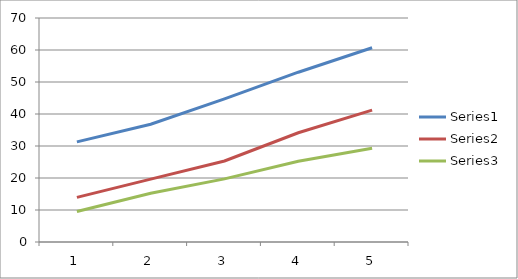
| Category | Series 0 | Series 1 | Series 2 |
|---|---|---|---|
| 0 | 31.296 | 13.95 | 9.547 |
| 1 | 36.785 | 19.657 | 15.231 |
| 2 | 44.734 | 25.331 | 19.735 |
| 3 | 53.061 | 34.146 | 25.232 |
| 4 | 60.694 | 41.218 | 29.274 |